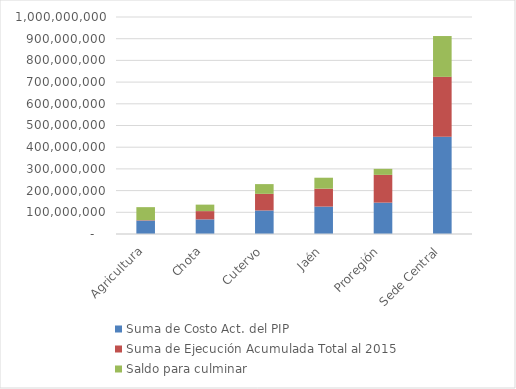
| Category | Suma de Costo Act. del PIP | Suma de Ejecución Acumulada Total al 2015 | Saldo para culminar  |
|---|---|---|---|
| Agricultura | 61861034.17 | 1913725.23 | 59947308.94 |
| Chota | 67369262.32 | 38065748.28 | 29886619.02 |
| Cutervo | 108462607.37 | 76507472.52 | 44959489.31 |
| Jaén | 126281375.88 | 82666451.91 | 50409272.08 |
| Proregión | 144591255.24 | 127850768.62 | 27781592.58 |
| Sede Central | 448187060.07 | 276009303.39 | 188087157.51 |